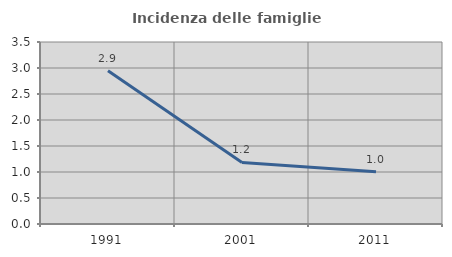
| Category | Incidenza delle famiglie numerose |
|---|---|
| 1991.0 | 2.948 |
| 2001.0 | 1.183 |
| 2011.0 | 1.003 |